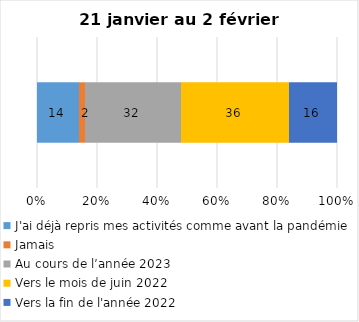
| Category | J'ai déjà repris mes activités comme avant la pandémie | Jamais | Au cours de l’année 2023 | Vers le mois de juin 2022 | Vers la fin de l'année 2022 |
|---|---|---|---|---|---|
| 0 | 14 | 2 | 32 | 36 | 16 |